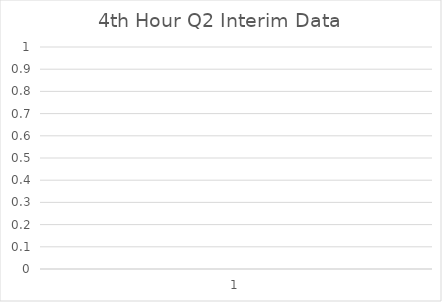
| Category | Series 0 | Series 1 | Series 2 | Series 3 | Series 4 | Series 5 | Series 6 | Series 7 | Series 8 | Series 9 | Series 10 |
|---|---|---|---|---|---|---|---|---|---|---|---|
| 0 | 0 | 0 | 0 | 0 | 0 | 0 | 0 | 0 | 0 | 0 | 0 |